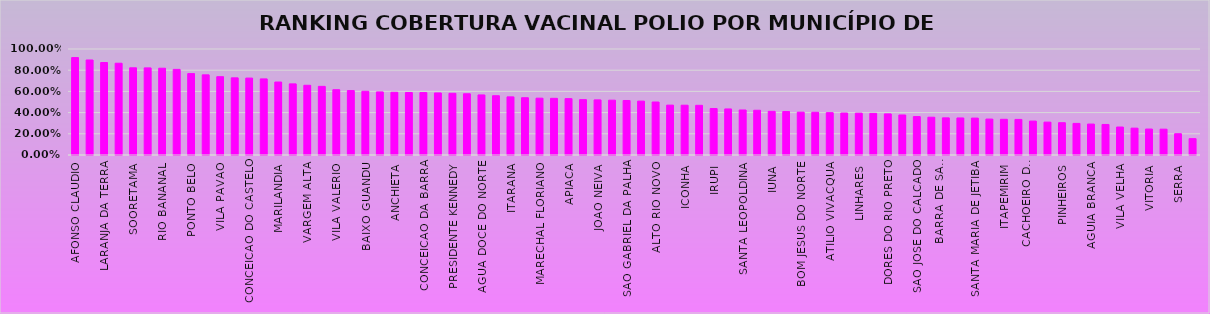
| Category | % COBERTURA VACINAL POLIO |
|---|---|
| AFONSO CLAUDIO | 0.919 |
| ALFREDO CHAVES | 0.896 |
| LARANJA DA TERRA | 0.873 |
| MUQUI | 0.866 |
| SOORETAMA | 0.823 |
| VENDA NOVA DO IMIGRANTE | 0.822 |
| RIO BANANAL | 0.819 |
| SAO ROQUE DO CANAA | 0.808 |
| PONTO BELO | 0.768 |
| IBIRACU | 0.756 |
| VILA PAVAO | 0.739 |
| ITAGUACU | 0.728 |
| CONCEICAO DO CASTELO | 0.726 |
| MUNIZ FREIRE | 0.718 |
| MARILANDIA | 0.688 |
| ALEGRE | 0.671 |
| VARGEM ALTA | 0.658 |
| BREJETUBA | 0.647 |
| VILA VALERIO | 0.616 |
| GOVERNADOR LINDENBERG | 0.608 |
| BAIXO GUANDU | 0.601 |
| CASTELO | 0.595 |
| ANCHIETA | 0.592 |
| SANTA TERESA | 0.59 |
| CONCEICAO DA BARRA | 0.589 |
| MUCURICI | 0.585 |
| PRESIDENTE KENNEDY | 0.582 |
| MONTANHA | 0.578 |
| AGUA DOCE DO NORTE | 0.567 |
| DOMINGOS MARTINS | 0.559 |
| ITARANA | 0.548 |
| JERONIMO MONTEIRO | 0.54 |
| MARECHAL FLORIANO | 0.536 |
| PANCAS | 0.535 |
| APIACA | 0.532 |
| JAGUARE | 0.522 |
| JOAO NEIVA | 0.52 |
| RIO NOVO DO SUL | 0.517 |
| SAO GABRIEL DA PALHA | 0.514 |
| BOA ESPERANCA | 0.508 |
| ALTO RIO NOVO | 0.5 |
| DIVINO DE SAO LOURENCO | 0.47 |
| ICONHA | 0.47 |
| PEDRO CANARIO | 0.469 |
| IRUPI | 0.438 |
| ARACRUZ | 0.434 |
| SANTA LEOPOLDINA | 0.425 |
| FUNDAO | 0.422 |
| IUNA | 0.412 |
| PIUMA | 0.41 |
| BOM JESUS DO NORTE | 0.404 |
| GUACUI | 0.403 |
| ATILIO VIVACQUA | 0.399 |
| IBATIBA | 0.396 |
| LINHARES | 0.395 |
| NOVA VENECIA | 0.393 |
| DORES DO RIO PRETO | 0.388 |
| MARATAIZES | 0.377 |
| SAO JOSE DO CALCADO | 0.362 |
| SAO DOMINGOS DO NORTE | 0.356 |
| BARRA DE SAO FRANCISCO | 0.35 |
| ECOPORANGA | 0.349 |
| SANTA MARIA DE JETIBA | 0.348 |
| IBITIRAMA | 0.339 |
| ITAPEMIRIM | 0.337 |
| MIMOSO DO SUL | 0.336 |
| CACHOEIRO DE ITAPEMIRIM | 0.32 |
| SAO MATEUS | 0.31 |
| PINHEIROS | 0.305 |
| GUARAPARI | 0.298 |
| AGUIA BRANCA | 0.292 |
| VIANA | 0.288 |
| VILA VELHA | 0.264 |
| CARIACICA | 0.253 |
| VITORIA | 0.245 |
| COLATINA | 0.244 |
| SERRA | 0.201 |
| MANTENOPOLIS | 0.154 |